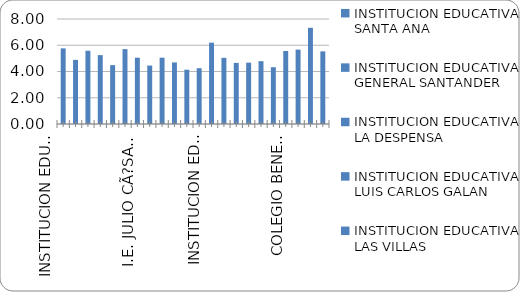
| Category | ISCE 2018 Secundaria |
|---|---|
| INSTITUCION EDUCATIVA SANTA ANA | 5.762 |
| INSTITUCION EDUCATIVA GENERAL SANTANDER | 4.887 |
| INSTITUCION EDUCATIVA LA DESPENSA | 5.582 |
| INSTITUCION EDUCATIVA LUIS CARLOS GALAN | 5.248 |
| INSTITUCION EDUCATIVA LAS VILLAS | 4.487 |
| INSTITUCION EDUCATIVA INTEGRADO DE SOACHA | 5.706 |
| I.E. JULIO CÃ?SAR TURBAY AYALA | 5.05 |
| INSTITUCION EDUCATIVA EDUARDO SANTOS | 4.452 |
| INSTITUCION EDUCATIVA CIUDAD LATINA | 5.052 |
| INSTITUCION EDUCATIVA CIUDADELA  SUCRE | 4.69 |
| INSTITUCION EDUCATIVA CAZUCA | 4.138 |
| INSTITUCION EDUCATIVA EL BOSQUE | 4.251 |
| INSTITUCION EDUCATIVA  SAN MATEO | 6.198 |
| INSTITUCION EDUCATIVA GABRIEL GARCIA MARQUEZ | 5.039 |
| INSTITUCION EDUCATIVA BUENOS AIRES | 4.655 |
| INSTITUCION EDUCATIVA COMPARTIR | 4.673 |
| INSTITUCION EDUCATIVA LEON XIII | 4.787 |
| INSTITUCION EDUCATIVA  NUEVO COMPARTIR | 4.328 |
| COLEGIO BENEDICTO XVI | 5.561 |
| INSTITUCION EDUCATIVA MANUELA BELTRAN | 5.668 |
| INSITITUCION EDUCATIVA EUGENIO DIAZ CASTRO | 7.33 |
| INSTITUCION EDUCATIVA  RICAURTE | 5.533 |